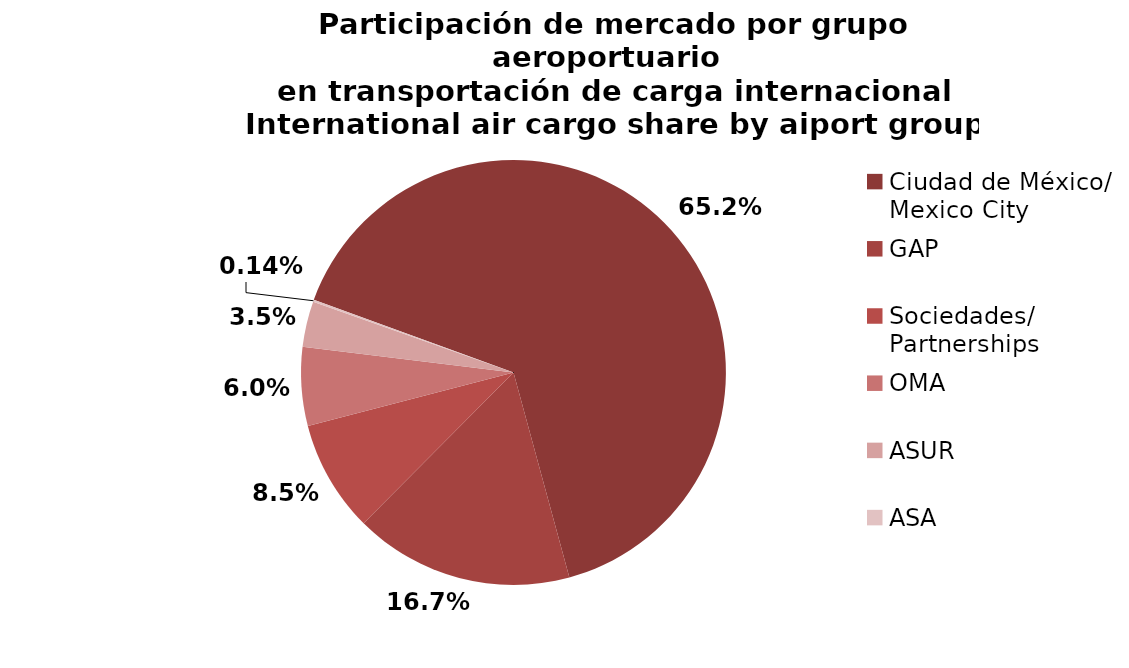
| Category | Series 0 |
|---|---|
| Ciudad de México/
Mexico City | 38560.64 |
| GAP | 9871.97 |
| Sociedades/
Partnerships | 5026.389 |
| OMA | 3532.359 |
| ASUR | 2056.201 |
| ASA | 87.064 |